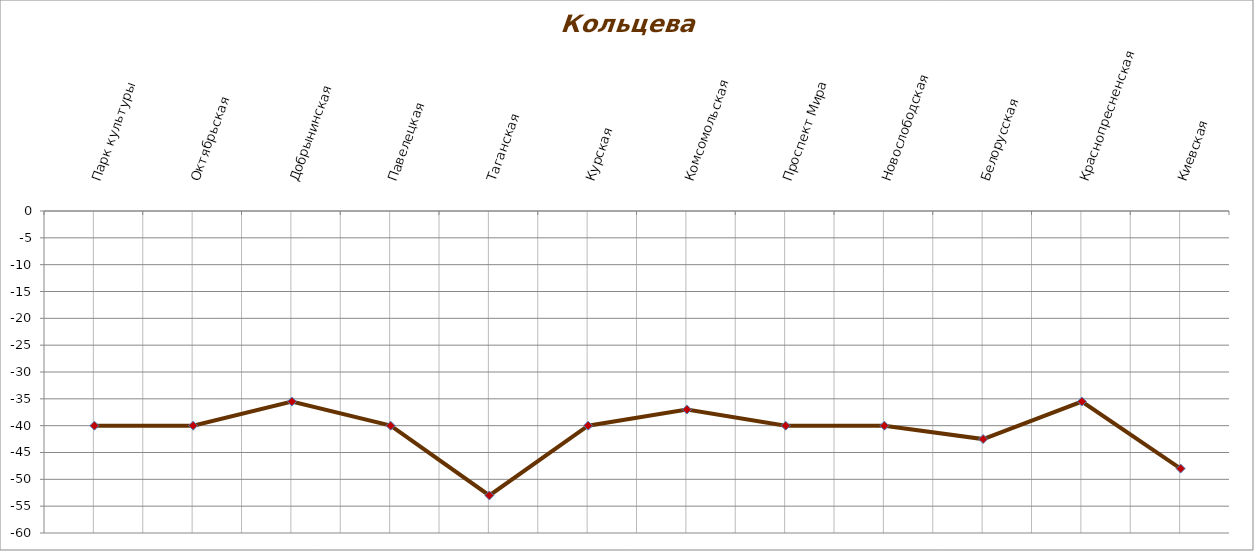
| Category | Series 0 |
|---|---|
| Парк культуры | -40 |
| Октябрьская | -40 |
| Добрынинская | -35.5 |
| Павелецкая | -40 |
| Таганская | -53 |
| Курская | -40 |
| Комсомольская | -37 |
| Проспект Мира | -40 |
| Новослободская | -40 |
| Белорусская | -42.5 |
| Краснопресненская | -35.5 |
| Киевская | -48 |